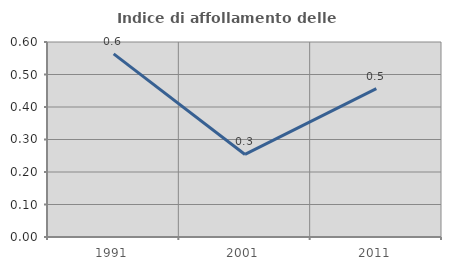
| Category | Indice di affollamento delle abitazioni  |
|---|---|
| 1991.0 | 0.563 |
| 2001.0 | 0.254 |
| 2011.0 | 0.456 |